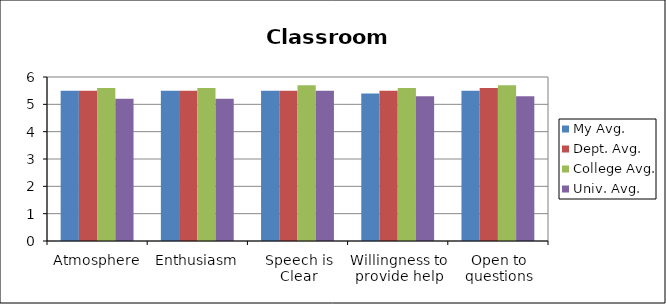
| Category | My Avg. | Dept. Avg. | College Avg. | Univ. Avg. |
|---|---|---|---|---|
| Atmosphere | 5.5 | 5.5 | 5.6 | 5.2 |
| Enthusiasm | 5.5 | 5.5 | 5.6 | 5.2 |
| Speech is Clear | 5.5 | 5.5 | 5.7 | 5.5 |
| Willingness to provide help | 5.4 | 5.5 | 5.6 | 5.3 |
| Open to questions | 5.5 | 5.6 | 5.7 | 5.3 |